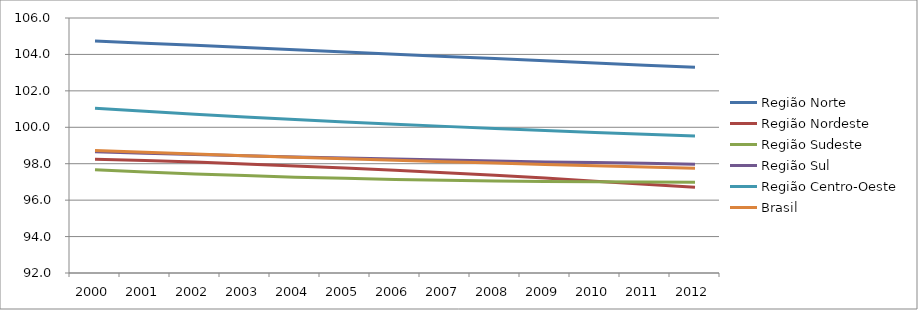
| Category | Região Norte | Região Nordeste | Região Sudeste | Região Sul | Região Centro-Oeste | Brasil |
|---|---|---|---|---|---|---|
| 2000.0 | 104.74 | 98.24 | 97.67 | 98.65 | 101.05 | 98.73 |
| 2001.0 | 104.62 | 98.17 | 97.55 | 98.57 | 100.88 | 98.63 |
| 2002.0 | 104.5 | 98.09 | 97.44 | 98.5 | 100.72 | 98.54 |
| 2003.0 | 104.38 | 97.99 | 97.35 | 98.44 | 100.57 | 98.44 |
| 2004.0 | 104.26 | 97.88 | 97.26 | 98.37 | 100.43 | 98.36 |
| 2005.0 | 104.13 | 97.77 | 97.2 | 98.31 | 100.29 | 98.27 |
| 2006.0 | 104.01 | 97.64 | 97.14 | 98.26 | 100.17 | 98.19 |
| 2007.0 | 103.89 | 97.5 | 97.09 | 98.2 | 100.05 | 98.11 |
| 2008.0 | 103.77 | 97.36 | 97.05 | 98.15 | 99.93 | 98.04 |
| 2009.0 | 103.65 | 97.21 | 97.03 | 98.1 | 99.82 | 97.96 |
| 2010.0 | 103.53 | 97.04 | 97.01 | 98.06 | 99.72 | 97.89 |
| 2011.0 | 103.41 | 96.87 | 96.99 | 98.02 | 99.62 | 97.82 |
| 2012.0 | 103.29 | 96.71 | 96.98 | 97.97 | 99.52 | 97.75 |